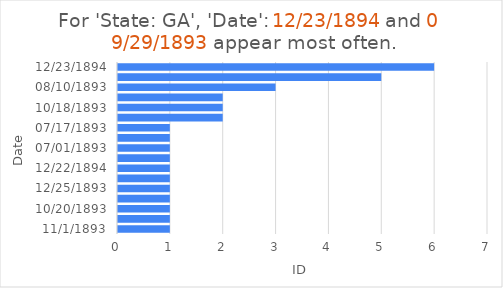
| Category | Total |
|---|---|
| 12/23/1894 | 6 |
| 09/29/1893 | 5 |
| 08/10/1893 | 3 |
| 6/29/1893 | 2 |
| 10/18/1893 | 2 |
| 10/27/1893 | 2 |
| 07/17/1893 | 1 |
| 12/19/1893 | 1 |
| 07/01/1893 | 1 |
| 8/14/1893 | 1 |
| 12/22/1894 | 1 |
| 03/05/1894 | 1 |
| 12/25/1893 | 1 |
| 11/29/1893 | 1 |
| 10/20/1893 | 1 |
| 12/02/1893 | 1 |
| 11/1/1893 | 1 |